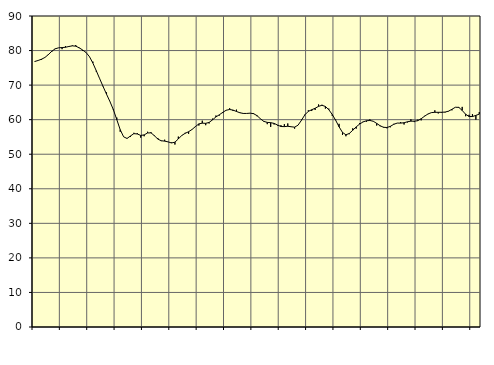
| Category | Piggar | Series 1 |
|---|---|---|
| nan | 76.9 | 76.83 |
| 87.0 | 77.1 | 77.13 |
| 87.0 | 77.3 | 77.5 |
| 87.0 | 78 | 78.01 |
| nan | 79 | 78.84 |
| 88.0 | 79.6 | 79.8 |
| 88.0 | 80.6 | 80.5 |
| 88.0 | 80.8 | 80.8 |
| nan | 80.4 | 80.86 |
| 89.0 | 81.3 | 80.95 |
| 89.0 | 81.1 | 81.18 |
| 89.0 | 81.5 | 81.36 |
| nan | 81.6 | 81.27 |
| 90.0 | 80.7 | 80.8 |
| 90.0 | 79.9 | 80.17 |
| 90.0 | 79.4 | 79.45 |
| nan | 78.3 | 78.25 |
| 91.0 | 76.8 | 76.39 |
| 91.0 | 73.9 | 74.16 |
| 91.0 | 71.9 | 71.86 |
| nan | 69.7 | 69.59 |
| 92.0 | 67.9 | 67.37 |
| 92.0 | 65.2 | 65.24 |
| 92.0 | 63.1 | 62.89 |
| nan | 60.6 | 60.02 |
| 93.0 | 56.5 | 57.1 |
| 93.0 | 55 | 55.03 |
| 93.0 | 54.5 | 54.56 |
| nan | 55 | 55.28 |
| 94.0 | 56.2 | 55.96 |
| 94.0 | 56.1 | 55.86 |
| 94.0 | 54.8 | 55.44 |
| nan | 55.2 | 55.59 |
| 95.0 | 56.5 | 56.15 |
| 95.0 | 56.4 | 56.19 |
| 95.0 | 55.5 | 55.36 |
| nan | 54.7 | 54.37 |
| 96.0 | 53.8 | 53.9 |
| 96.0 | 54.2 | 53.79 |
| 96.0 | 53.6 | 53.57 |
| nan | 53.4 | 53.26 |
| 97.0 | 52.8 | 53.49 |
| 97.0 | 55.1 | 54.42 |
| 97.0 | 55.5 | 55.43 |
| nan | 56.2 | 56.05 |
| 98.0 | 55.9 | 56.51 |
| 98.0 | 57.2 | 57.16 |
| 98.0 | 58.1 | 58 |
| nan | 58.3 | 58.78 |
| 99.0 | 59.7 | 58.99 |
| 99.0 | 58.4 | 58.94 |
| 99.0 | 58.9 | 59.2 |
| nan | 60.3 | 59.95 |
| 0.0 | 61.2 | 60.8 |
| 0.0 | 61.2 | 61.42 |
| 0.0 | 61.9 | 62.13 |
| nan | 62.8 | 62.73 |
| 1.0 | 63.3 | 62.94 |
| 1.0 | 62.5 | 62.77 |
| 1.0 | 62.9 | 62.37 |
| nan | 62.1 | 62 |
| 2.0 | 61.9 | 61.8 |
| 2.0 | 61.8 | 61.8 |
| 2.0 | 61.9 | 61.88 |
| nan | 61.9 | 61.73 |
| 3.0 | 61 | 61.17 |
| 3.0 | 60.3 | 60.26 |
| 3.0 | 59.4 | 59.5 |
| nan | 58.7 | 59.22 |
| 4.0 | 57.9 | 59.13 |
| 4.0 | 58.6 | 58.92 |
| 4.0 | 58.3 | 58.45 |
| nan | 58.4 | 58.02 |
| 5.0 | 58.7 | 57.99 |
| 5.0 | 58.9 | 58.09 |
| 5.0 | 58 | 57.95 |
| nan | 57.4 | 57.83 |
| 6.0 | 58.4 | 58.41 |
| 6.0 | 60 | 59.82 |
| 6.0 | 61.5 | 61.41 |
| nan | 62.7 | 62.4 |
| 7.0 | 62.5 | 62.87 |
| 7.0 | 62.8 | 63.3 |
| 7.0 | 64.4 | 63.85 |
| nan | 64.3 | 64.17 |
| 8.0 | 63.2 | 63.82 |
| 8.0 | 63.2 | 62.88 |
| 8.0 | 61.1 | 61.5 |
| nan | 60 | 59.83 |
| 9.0 | 58.8 | 57.93 |
| 9.0 | 55.6 | 56.31 |
| 9.0 | 55.2 | 55.62 |
| nan | 55.8 | 56.01 |
| 10.0 | 57.5 | 56.93 |
| 10.0 | 57.4 | 57.91 |
| 10.0 | 59 | 58.72 |
| nan | 59.4 | 59.34 |
| 11.0 | 59.4 | 59.68 |
| 11.0 | 60.1 | 59.77 |
| 11.0 | 59.6 | 59.54 |
| nan | 58.3 | 58.92 |
| 12.0 | 58.1 | 58.24 |
| 12.0 | 57.9 | 57.79 |
| 12.0 | 57.5 | 57.73 |
| nan | 57.8 | 58.07 |
| 13.0 | 58.8 | 58.66 |
| 13.0 | 59 | 59.01 |
| 13.0 | 59.3 | 59 |
| nan | 58.6 | 59.11 |
| 14.0 | 59.2 | 59.39 |
| 14.0 | 60.1 | 59.57 |
| 14.0 | 59.3 | 59.55 |
| nan | 60 | 59.7 |
| 15.0 | 59.8 | 60.27 |
| 15.0 | 61.1 | 61 |
| 15.0 | 61.6 | 61.65 |
| nan | 62 | 62.04 |
| 16.0 | 62.7 | 62.13 |
| 16.0 | 61.8 | 62.13 |
| 16.0 | 62 | 62.14 |
| nan | 62.1 | 62.2 |
| 17.0 | 62.4 | 62.46 |
| 17.0 | 62.7 | 63 |
| 17.0 | 63.6 | 63.59 |
| nan | 63.4 | 63.56 |
| 18.0 | 63.7 | 62.67 |
| 18.0 | 61 | 61.57 |
| 18.0 | 61.4 | 60.92 |
| nan | 61.6 | 60.9 |
| 19.0 | 60 | 61.24 |
| 19.0 | 62.2 | 61.6 |